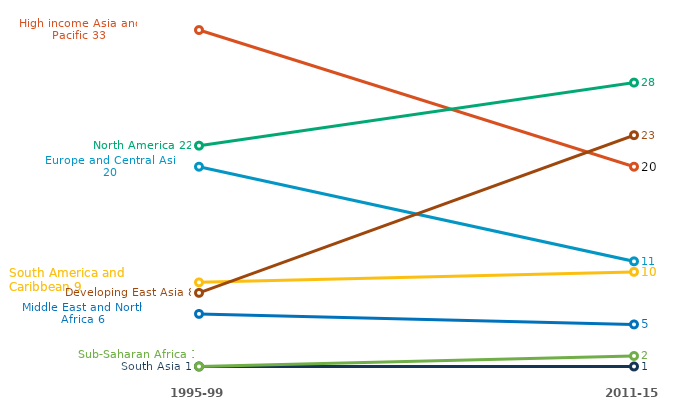
| Category | Europe and Central Asia | High income Asia and Pacific | North America | South America and Caribbean | Developing East Asia | South Asia | Sub-Saharan Africa | Middle East and North Africa |
|---|---|---|---|---|---|---|---|---|
| 1995-99 Average | 20 | 33 | 22 | 9 | 8 | 1 | 1 | 6 |
| 2011-15 Average | 11 | 20 | 28 | 10 | 23 | 1 | 2 | 5 |